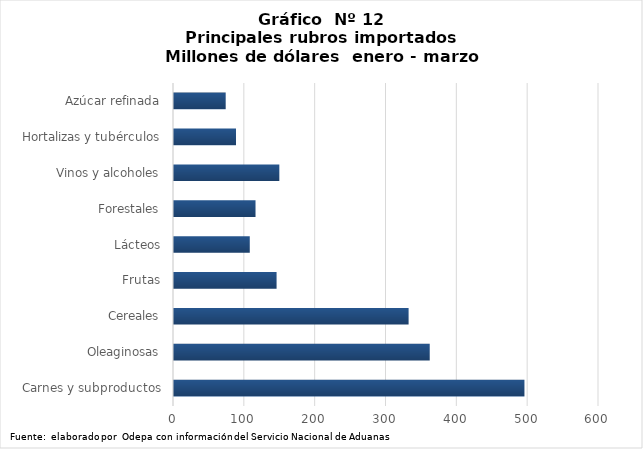
| Category | Series 0 |
|---|---|
| Carnes y subproductos | 494745.389 |
| Oleaginosas | 361027.493 |
| Cereales | 331199.238 |
| Frutas | 144817.362 |
| Lácteos | 106971.301 |
| Forestales | 115091 |
| Vinos y alcoholes | 148708.639 |
| Hortalizas y tubérculos | 87525.142 |
| Azúcar refinada | 72977.682 |